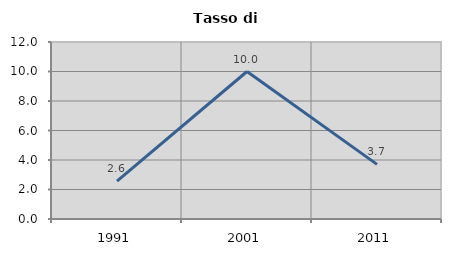
| Category | Tasso di disoccupazione   |
|---|---|
| 1991.0 | 2.564 |
| 2001.0 | 10 |
| 2011.0 | 3.704 |